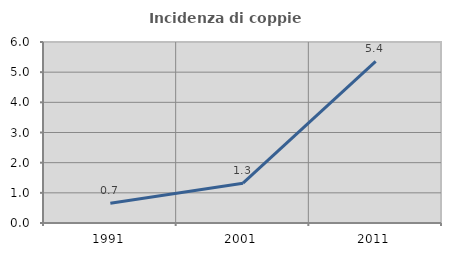
| Category | Incidenza di coppie miste |
|---|---|
| 1991.0 | 0.651 |
| 2001.0 | 1.32 |
| 2011.0 | 5.357 |